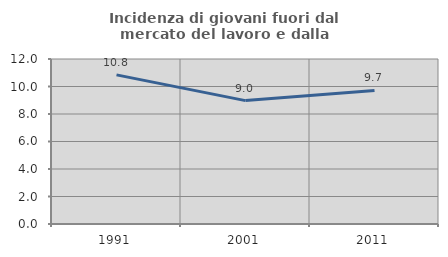
| Category | Incidenza di giovani fuori dal mercato del lavoro e dalla formazione  |
|---|---|
| 1991.0 | 10.843 |
| 2001.0 | 8.974 |
| 2011.0 | 9.717 |